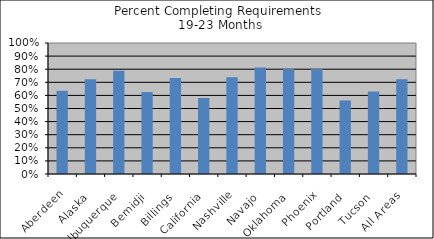
| Category | % Comp. Req. |
|---|---|
| Aberdeen | 0.635 |
| Alaska | 0.723 |
| Albuquerque | 0.788 |
| Bemidji | 0.626 |
| Billings | 0.732 |
| California | 0.58 |
| Nashville | 0.739 |
| Navajo | 0.814 |
| Oklahoma | 0.802 |
| Phoenix | 0.802 |
| Portland | 0.561 |
| Tucson | 0.63 |
|  All Areas | 0.723 |